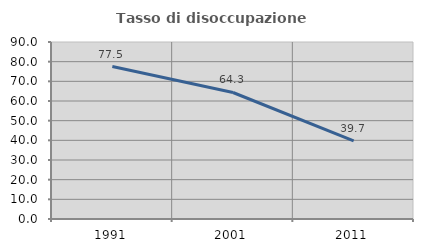
| Category | Tasso di disoccupazione giovanile  |
|---|---|
| 1991.0 | 77.514 |
| 2001.0 | 64.325 |
| 2011.0 | 39.749 |